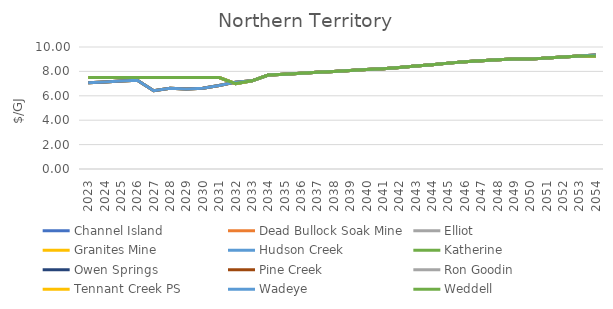
| Category | Channel Island | Dead Bullock Soak Mine | Elliot | Granites Mine | Hudson Creek | Katherine | Owen Springs | Pine Creek | Ron Goodin | Tennant Creek PS | Wadeye | Weddell |
|---|---|---|---|---|---|---|---|---|---|---|---|---|
| 2023.0 | 7.5 | 7.075 | 7.075 | 7.075 | 7.075 | 7.5 | 7.5 | 7.075 | 7.5 | 7.5 | 7.075 | 7.5 |
| 2024.0 | 7.5 | 7.14 | 7.14 | 7.14 | 7.14 | 7.5 | 7.5 | 7.14 | 7.5 | 7.5 | 7.14 | 7.5 |
| 2025.0 | 7.5 | 7.206 | 7.206 | 7.206 | 7.206 | 7.5 | 7.5 | 7.206 | 7.5 | 7.5 | 7.206 | 7.5 |
| 2026.0 | 7.5 | 7.272 | 7.272 | 7.272 | 7.272 | 7.5 | 7.5 | 7.272 | 7.5 | 7.5 | 7.272 | 7.5 |
| 2027.0 | 7.5 | 6.414 | 6.414 | 6.414 | 6.414 | 7.5 | 7.5 | 6.414 | 7.5 | 7.5 | 6.414 | 7.5 |
| 2028.0 | 7.5 | 6.613 | 6.613 | 6.613 | 6.613 | 7.5 | 7.5 | 6.613 | 7.5 | 7.5 | 6.613 | 7.5 |
| 2029.0 | 7.5 | 6.548 | 6.548 | 6.548 | 6.548 | 7.5 | 7.5 | 6.548 | 7.5 | 7.5 | 6.548 | 7.5 |
| 2030.0 | 7.5 | 6.62 | 6.62 | 6.62 | 6.62 | 7.5 | 7.5 | 6.62 | 7.5 | 7.5 | 6.62 | 7.5 |
| 2031.0 | 7.5 | 6.844 | 6.844 | 6.844 | 6.844 | 7.5 | 7.5 | 6.844 | 7.5 | 7.5 | 6.844 | 7.5 |
| 2032.0 | 7 | 7.12 | 7.12 | 7.12 | 7.12 | 7 | 7 | 7.12 | 7 | 7 | 7.12 | 7 |
| 2033.0 | 7.228 | 7.228 | 7.228 | 7.228 | 7.228 | 7.228 | 7.228 | 7.228 | 7.228 | 7.228 | 7.228 | 7.228 |
| 2034.0 | 7.702 | 7.702 | 7.702 | 7.702 | 7.702 | 7.702 | 7.702 | 7.702 | 7.702 | 7.702 | 7.702 | 7.702 |
| 2035.0 | 7.774 | 7.774 | 7.774 | 7.774 | 7.774 | 7.774 | 7.774 | 7.774 | 7.774 | 7.774 | 7.774 | 7.774 |
| 2036.0 | 7.848 | 7.848 | 7.848 | 7.848 | 7.848 | 7.848 | 7.848 | 7.848 | 7.848 | 7.848 | 7.848 | 7.848 |
| 2037.0 | 7.922 | 7.922 | 7.922 | 7.922 | 7.922 | 7.922 | 7.922 | 7.922 | 7.922 | 7.922 | 7.922 | 7.922 |
| 2038.0 | 7.996 | 7.996 | 7.996 | 7.996 | 7.996 | 7.996 | 7.996 | 7.996 | 7.996 | 7.996 | 7.996 | 7.996 |
| 2039.0 | 8.072 | 8.072 | 8.072 | 8.072 | 8.072 | 8.072 | 8.072 | 8.072 | 8.072 | 8.072 | 8.072 | 8.072 |
| 2040.0 | 8.148 | 8.148 | 8.148 | 8.148 | 8.148 | 8.148 | 8.148 | 8.148 | 8.148 | 8.148 | 8.148 | 8.148 |
| 2041.0 | 8.225 | 8.225 | 8.225 | 8.225 | 8.225 | 8.225 | 8.225 | 8.225 | 8.225 | 8.225 | 8.225 | 8.225 |
| 2042.0 | 8.322 | 8.322 | 8.322 | 8.322 | 8.322 | 8.322 | 8.322 | 8.322 | 8.322 | 8.322 | 8.322 | 8.322 |
| 2043.0 | 8.437 | 8.437 | 8.437 | 8.437 | 8.437 | 8.437 | 8.437 | 8.437 | 8.437 | 8.437 | 8.437 | 8.437 |
| 2044.0 | 8.545 | 8.545 | 8.545 | 8.545 | 8.545 | 8.545 | 8.545 | 8.545 | 8.545 | 8.545 | 8.545 | 8.545 |
| 2045.0 | 8.678 | 8.678 | 8.678 | 8.678 | 8.678 | 8.678 | 8.678 | 8.678 | 8.678 | 8.678 | 8.678 | 8.678 |
| 2046.0 | 8.8 | 8.8 | 8.8 | 8.8 | 8.8 | 8.8 | 8.8 | 8.8 | 8.8 | 8.8 | 8.8 | 8.8 |
| 2047.0 | 8.876 | 8.876 | 8.876 | 8.876 | 8.876 | 8.876 | 8.876 | 8.876 | 8.876 | 8.876 | 8.876 | 8.876 |
| 2048.0 | 8.945 | 8.945 | 8.945 | 8.945 | 8.945 | 8.945 | 8.945 | 8.945 | 8.945 | 8.945 | 8.945 | 8.945 |
| 2049.0 | 9.006 | 9.006 | 9.006 | 9.006 | 9.006 | 9.006 | 9.006 | 9.006 | 9.006 | 9.006 | 9.006 | 9.006 |
| 2050.0 | 9.006 | 9.006 | 9.006 | 9.006 | 9.006 | 9.006 | 9.006 | 9.006 | 9.006 | 9.006 | 9.006 | 9.006 |
| 2051.0 | 9.091 | 9.091 | 9.091 | 9.091 | 9.091 | 9.091 | 9.091 | 9.091 | 9.091 | 9.091 | 9.091 | 9.091 |
| 2052.0 | 9.176 | 9.176 | 9.176 | 9.176 | 9.176 | 9.176 | 9.176 | 9.176 | 9.176 | 9.176 | 9.176 | 9.176 |
| 2053.0 | 9.262 | 9.262 | 9.262 | 9.262 | 9.262 | 9.262 | 9.262 | 9.262 | 9.262 | 9.262 | 9.262 | 9.262 |
| 2054.0 | 9.262 | 9.349 | 9.349 | 9.349 | 9.349 | 9.262 | 9.262 | 9.349 | 9.262 | 9.262 | 9.349 | 9.262 |